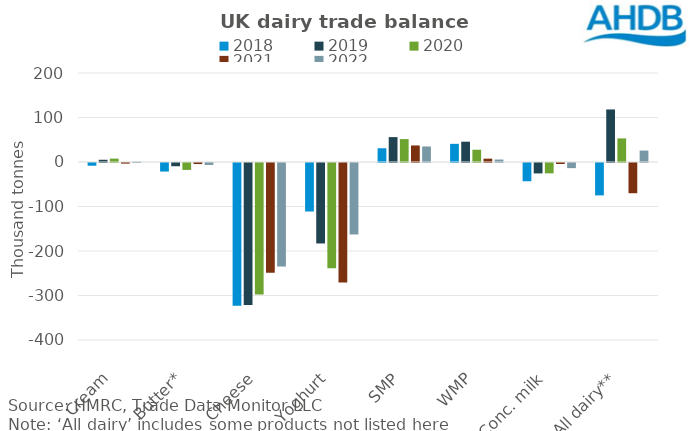
| Category | 2018 | 2019 | 2020 | 2021 | 2022 |
|---|---|---|---|---|---|
| Cream | -6.119 | 5.022 | 7.602 | -1.447 | 0.628 |
| Butter* | -19.202 | -7.295 | -15.568 | -2.357 | -4.383 |
| Cheese | -320.627 | -318.956 | -295.623 | -246.528 | -232.573 |
| Yoghurt | -108.983 | -180.808 | -236.534 | -268.699 | -160.569 |
| SMP | 30.909 | 55.94 | 51.466 | 37.17 | 34.872 |
| WMP | 40.832 | 45.634 | 27.581 | 7.497 | 5.556 |
| Conc. milk | -41.005 | -23.419 | -23.232 | -2.224 | -11.528 |
| All dairy** | -72.78 | 118.057 | 53.023 | -67.938 | 25.692 |